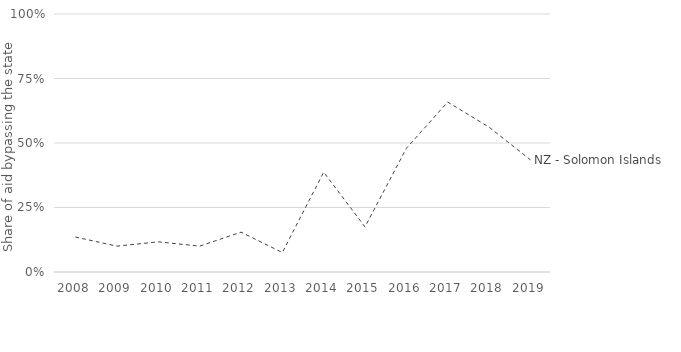
| Category | NZ - Solomon Islands |
|---|---|
| 2008.0 | 0.135 |
| 2009.0 | 0.1 |
| 2010.0 | 0.117 |
| 2011.0 | 0.1 |
| 2012.0 | 0.154 |
| 2013.0 | 0.075 |
| 2014.0 | 0.387 |
| 2015.0 | 0.175 |
| 2016.0 | 0.479 |
| 2017.0 | 0.659 |
| 2018.0 | 0.562 |
| 2019.0 | 0.435 |